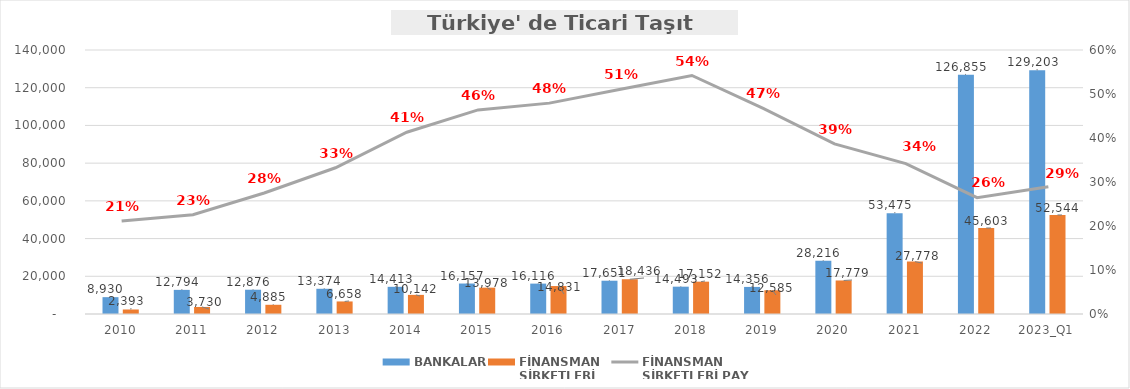
| Category | BANKALAR | FİNANSMAN 
ŞİRKETLERİ |
|---|---|---|
| 2010 | 8930.131 | 2392.721 |
| 2011 | 12793.723 | 3729.987 |
| 2012 | 12876.346 | 4885.495 |
| 2013 | 13374.424 | 6657.806 |
| 2014 | 14412.767 | 10141.887 |
| 2015 | 16157.225 | 13978.426 |
| 2016 | 16116.463 | 14831.249 |
| 2017 | 17650.963 | 18436.034 |
| 2018 | 14492.83 | 17152.034 |
| 2019 | 14355.978 | 12584.792 |
| 2020 | 28216.157 | 17779.072 |
| 2021 | 53475.488 | 27778.353 |
| 2022 | 126855.404 | 45602.871 |
| 2023_Q1 | 129203.313 | 52544.047 |